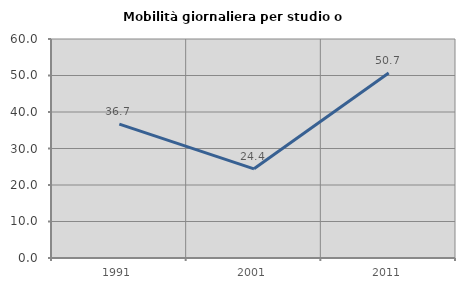
| Category | Mobilità giornaliera per studio o lavoro |
|---|---|
| 1991.0 | 36.697 |
| 2001.0 | 24.432 |
| 2011.0 | 50.676 |